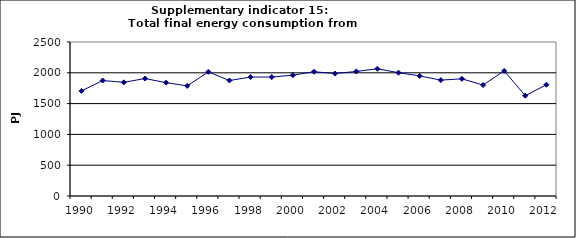
| Category | Total final energy consumption from households, PJ |
|---|---|
| 1990 | 1706.351 |
| 1991 | 1874.334 |
| 1992 | 1844.968 |
| 1993 | 1907.029 |
| 1994 | 1839.956 |
| 1995 | 1787.374 |
| 1996 | 2014.683 |
| 1997 | 1874.656 |
| 1998 | 1931.199 |
| 1999 | 1930.987 |
| 2000 | 1961.565 |
| 2001 | 2017.13 |
| 2002 | 1987.5 |
| 2003 | 2021.932 |
| 2004 | 2065.466 |
| 2005 | 2001.473 |
| 2006 | 1949.953 |
| 2007 | 1881.18 |
| 2008 | 1902.314 |
| 2009 | 1801.367 |
| 2010 | 2030.298 |
| 2011 | 1628.36 |
| 2012 | 1806.737 |